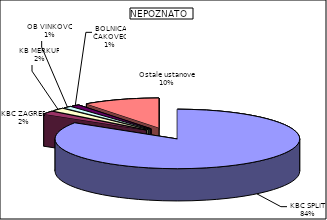
| Category | Series 0 |
|---|---|
| KBC SPLIT | 84.143 |
| KBC ZAGREB  | 1.809 |
| KB "MERKUR" | 1.728 |
| OB VINKOVCI | 1.125 |
| BOLNICA ČAKOVEC | 1.092 |
| Ostale ustanove | 10.104 |